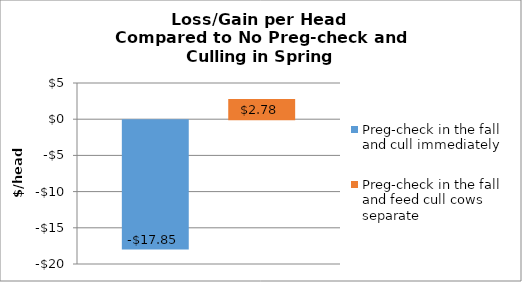
| Category | Preg-check in the fall and cull immediately | Preg-check in the fall and feed cull cows separate |
|---|---|---|
| 0 | -17.853 | 2.782 |